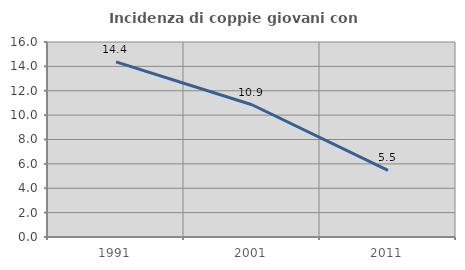
| Category | Incidenza di coppie giovani con figli |
|---|---|
| 1991.0 | 14.364 |
| 2001.0 | 10.852 |
| 2011.0 | 5.461 |